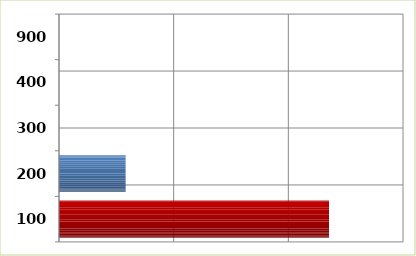
| Category | Series 0 |
|---|---|
| 100.0 | 235467844 |
| 200.0 | 58088980 |
| 300.0 | 0 |
| 400.0 | 0 |
| 900.0 | 0 |